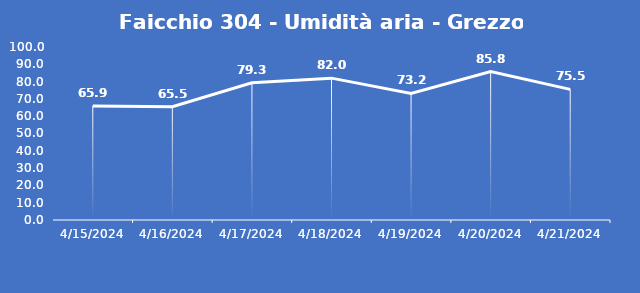
| Category | Faicchio 304 - Umidità aria - Grezzo (%) |
|---|---|
| 4/15/24 | 65.9 |
| 4/16/24 | 65.5 |
| 4/17/24 | 79.3 |
| 4/18/24 | 82 |
| 4/19/24 | 73.2 |
| 4/20/24 | 85.8 |
| 4/21/24 | 75.5 |